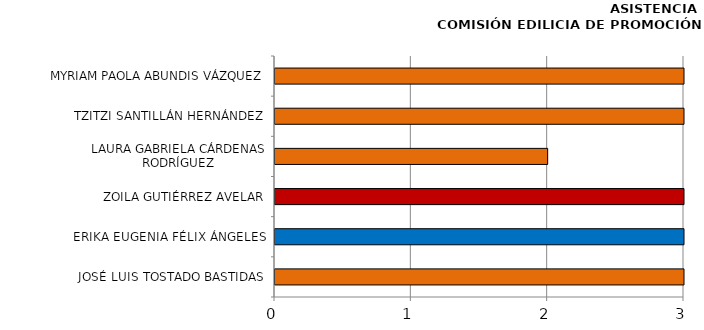
| Category | Series 0 |
|---|---|
| JOSÉ LUIS TOSTADO BASTIDAS | 3 |
| ERIKA EUGENIA FÉLIX ÁNGELES | 3 |
| ZOILA GUTIÉRREZ AVELAR | 3 |
| LAURA GABRIELA CÁRDENAS RODRÍGUEZ | 2 |
| TZITZI SANTILLÁN HERNÁNDEZ | 3 |
| MYRIAM PAOLA ABUNDIS VÁZQUEZ | 3 |